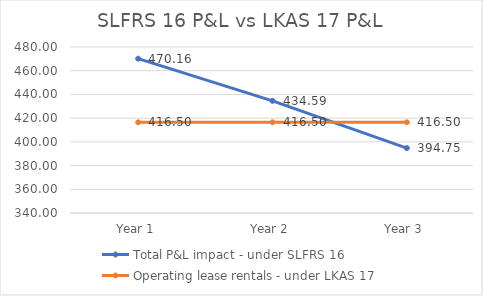
| Category | Total P&L impact - under SLFRS 16 | Operating lease rentals - under LKAS 17 |
|---|---|---|
|  Year 1  | 470.164 | 416.5 |
|  Year 2  | 434.59 | 416.5 |
|  Year 3  | 394.746 | 416.5 |